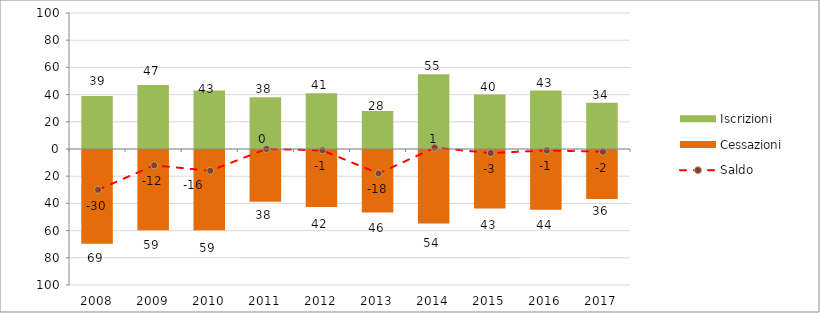
| Category | Iscrizioni | Cessazioni |
|---|---|---|
| 2008.0 | 39 | -69 |
| 2009.0 | 47 | -59 |
| 2010.0 | 43 | -59 |
| 2011.0 | 38 | -38 |
| 2012.0 | 41 | -42 |
| 2013.0 | 28 | -46 |
| 2014.0 | 55 | -54 |
| 2015.0 | 40 | -43 |
| 2016.0 | 43 | -44 |
| 2017.0 | 34 | -36 |